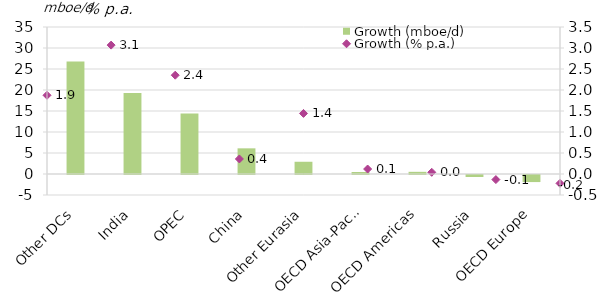
| Category | Growth (mboe/d) |
|---|---|
| Other DCs | 26.795 |
| India | 19.282 |
| OPEC | 14.381 |
| China | 6.11 |
| Other Eurasia | 2.915 |
| OECD Asia-Pacific | 0.483 |
| OECD Americas | 0.517 |
| Russia | -0.473 |
| OECD Europe | -1.684 |